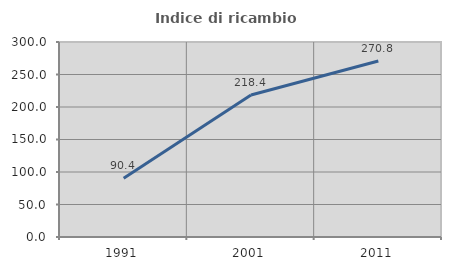
| Category | Indice di ricambio occupazionale  |
|---|---|
| 1991.0 | 90.411 |
| 2001.0 | 218.357 |
| 2011.0 | 270.833 |